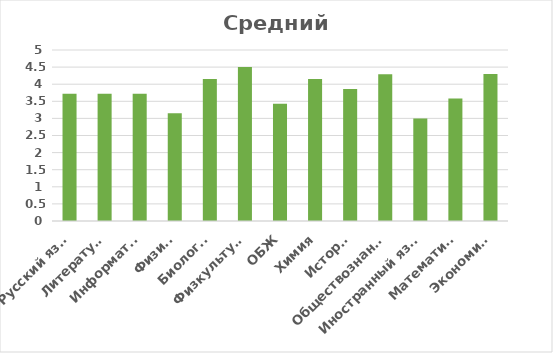
| Category | Средний балл |
|---|---|
| Русский язык  | 3.72 |
| Литература | 3.72 |
| Информатка | 3.72 |
| Физика | 3.15 |
| Биология | 4.15 |
| Физкультура | 4.5 |
| ОБЖ | 3.43 |
| Химия | 4.15 |
| История | 3.86 |
| Обществознание | 4.29 |
| Иностранный язык | 3 |
| Математика | 3.58 |
| Экономика | 4.3 |